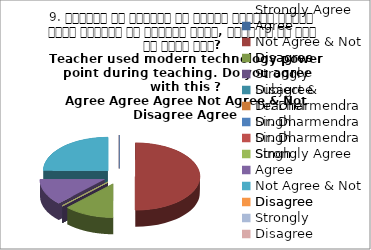
| Category | 9. शिक्षक ने शिक्षण के दौरान आधुनिक तकनीक पावर पॉइन्ट का प्रयोग किया, क्या आप इस बात से सहमत हैं? 
Teacher used modern technology power point during teaching. Do you agree with this ?
 Agree Agree Agree Not Agree & Not Disagree Agree |
|---|---|
| Strongly Agree | 0 |
| Agree | 4 |
| Not Agree & Not Disagree | 1 |
| Disagree | 0 |
| Strongly Disagree | 0 |
| Subject & Teacher | 0 |
| Dr. Dharmendra Singh | 0 |
| Dr. Dharmendra Singh | 0 |
| Dr. Dharmendra Singh | 0 |
| Strongly Agree | 1 |
| Agree | 2 |
| Not Agree & Not Disagree | 0 |
| Disagree | 0 |
| Strongly Disagree | 0 |